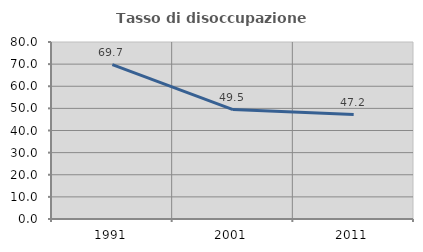
| Category | Tasso di disoccupazione giovanile  |
|---|---|
| 1991.0 | 69.748 |
| 2001.0 | 49.451 |
| 2011.0 | 47.222 |